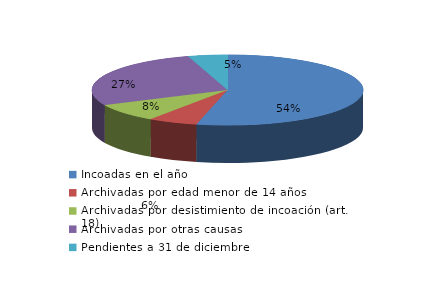
| Category | Series 0 |
|---|---|
| Incoadas en el año | 1343 |
| Archivadas por edad menor de 14 años | 148 |
| Archivadas por desistimiento de incoación (art. 18) | 211 |
| Archivadas por otras causas | 684 |
| Pendientes a 31 de diciembre | 117 |